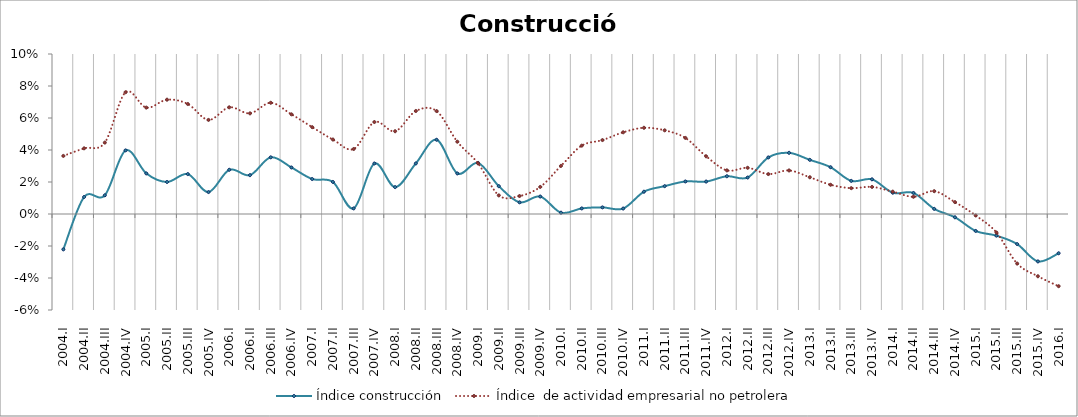
| Category | Índice construcción | Índice  de actividad empresarial no petrolera |
|---|---|---|
| 2004.I | -0.022 | 0.036 |
| 2004.II | 0.011 | 0.041 |
| 2004.III | 0.012 | 0.045 |
| 2004.IV | 0.04 | 0.076 |
| 2005.I | 0.025 | 0.066 |
| 2005.II | 0.02 | 0.071 |
| 2005.III | 0.025 | 0.069 |
| 2005.IV | 0.014 | 0.059 |
| 2006.I | 0.028 | 0.067 |
| 2006.II | 0.024 | 0.063 |
| 2006.III | 0.035 | 0.07 |
| 2006.IV | 0.029 | 0.062 |
| 2007.I | 0.022 | 0.054 |
| 2007.II | 0.02 | 0.047 |
| 2007.III | 0.003 | 0.041 |
| 2007.IV | 0.032 | 0.057 |
| 2008.I | 0.017 | 0.052 |
| 2008.II | 0.032 | 0.064 |
| 2008.III | 0.046 | 0.064 |
| 2008.IV | 0.025 | 0.045 |
| 2009.I | 0.032 | 0.032 |
| 2009.II | 0.017 | 0.012 |
| 2009.III | 0.007 | 0.011 |
| 2009.IV | 0.011 | 0.017 |
| 2010.I | 0.001 | 0.03 |
| 2010.II | 0.003 | 0.043 |
| 2010.III | 0.004 | 0.046 |
| 2010.IV | 0.003 | 0.051 |
| 2011.I | 0.014 | 0.054 |
| 2011.II | 0.017 | 0.052 |
| 2011.III | 0.02 | 0.048 |
| 2011.IV | 0.02 | 0.036 |
| 2012.I | 0.024 | 0.027 |
| 2012.II | 0.023 | 0.029 |
| 2012.III | 0.035 | 0.025 |
| 2012.IV | 0.038 | 0.027 |
| 2013.I | 0.034 | 0.023 |
| 2013.II | 0.029 | 0.018 |
| 2013.III | 0.021 | 0.016 |
| 2013.IV | 0.022 | 0.017 |
| 2014.I | 0.013 | 0.014 |
| 2014.II | 0.013 | 0.011 |
| 2014.III | 0.003 | 0.014 |
| 2014.IV | -0.002 | 0.007 |
| 2015.I | -0.011 | -0.001 |
| 2015.II | -0.014 | -0.012 |
| 2015.III | -0.019 | -0.031 |
| 2015.IV | -0.03 | -0.039 |
| 2016.I | -0.025 | -0.045 |